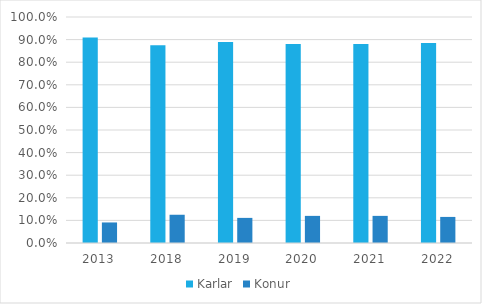
| Category | Karlar | Konur |
|---|---|---|
| 2013.0 | 0.909 | 0.091 |
| 2018.0 | 0.875 | 0.125 |
| 2019.0 | 0.889 | 0.111 |
| 2020.0 | 0.88 | 0.12 |
| 2021.0 | 0.88 | 0.12 |
| 2022.0 | 0.885 | 0.115 |